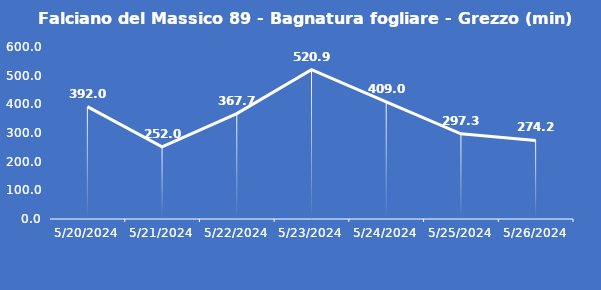
| Category | Falciano del Massico 89 - Bagnatura fogliare - Grezzo (min) |
|---|---|
| 5/20/24 | 392 |
| 5/21/24 | 252 |
| 5/22/24 | 367.7 |
| 5/23/24 | 520.9 |
| 5/24/24 | 409 |
| 5/25/24 | 297.3 |
| 5/26/24 | 274.2 |